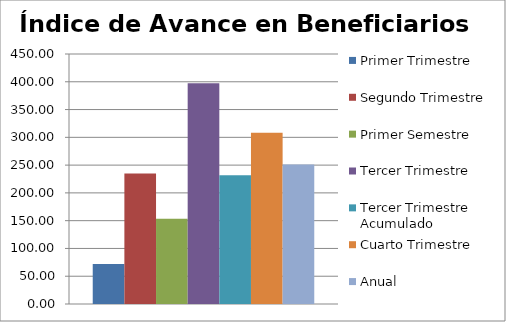
| Category | Primer Trimestre | Segundo Trimestre | Primer Semestre | Tercer Trimestre | Tercer Trimestre Acumulado | Cuarto Trimestre | Anual |
|---|---|---|---|---|---|---|---|
| 0 | 72.064 | 234.729 | 153.396 | 397.422 | 231.747 | 308.208 | 251.135 |